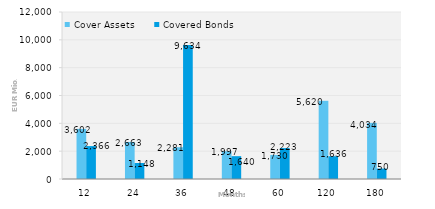
| Category | Cover Assets | Covered Bonds |
|---|---|---|
| 12.0 | 3601.713 | 2366 |
| 24.0 | 2662.87 | 1148 |
| 36.0 | 2281.433 | 9634 |
| 48.0 | 1996.506 | 1640 |
| 60.0 | 1729.579 | 2222.5 |
| 120.0 | 5619.613 | 1636 |
| 180.0 | 4033.821 | 750 |